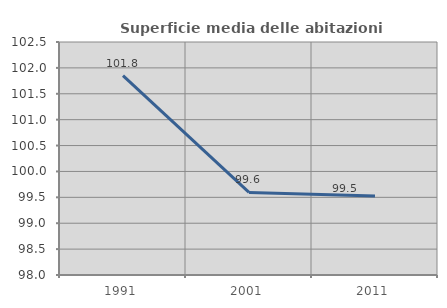
| Category | Superficie media delle abitazioni occupate |
|---|---|
| 1991.0 | 101.849 |
| 2001.0 | 99.594 |
| 2011.0 | 99.525 |